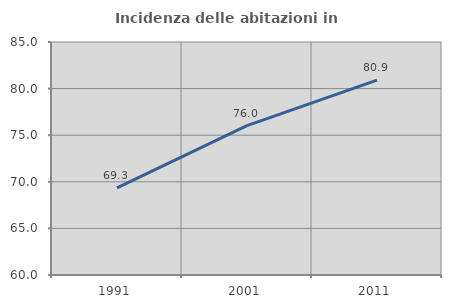
| Category | Incidenza delle abitazioni in proprietà  |
|---|---|
| 1991.0 | 69.343 |
| 2001.0 | 76.02 |
| 2011.0 | 80.91 |